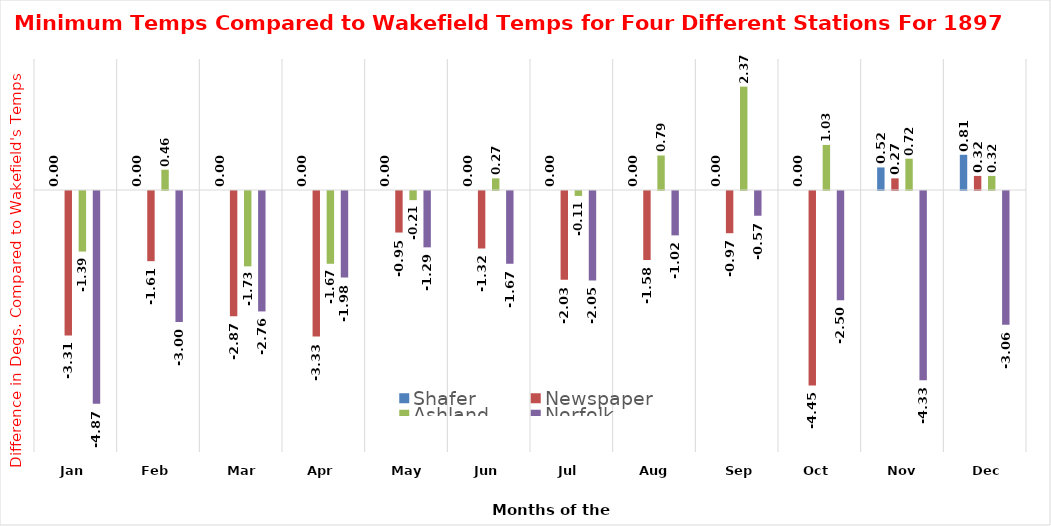
| Category | Shafer | Newspaper | Ashland   | Norfolk |
|---|---|---|---|---|
| Jan | 0 | -3.306 | -1.387 | -4.871 |
| Feb | 0 | -1.607 | 0.464 | -3 |
| Mar | 0 | -2.871 | -1.726 | -2.758 |
| Apr | 0 | -3.333 | -1.667 | -1.983 |
| May | 0 | -0.952 | -0.21 | -1.29 |
| Jun | 0 | -1.317 | 0.267 | -1.667 |
| Jul | 0 | -2.032 | -0.113 | -2.048 |
| Aug | 0 | -1.581 | 0.79 | -1.016 |
| Sep | 0 | -0.967 | 2.367 | -0.567 |
| Oct | 0 | -4.452 | 1.032 | -2.5 |
| Nov | 0.517 | 0.267 | 0.717 | -4.333 |
| Dec | 0.806 | 0.323 | 0.323 | -3.065 |